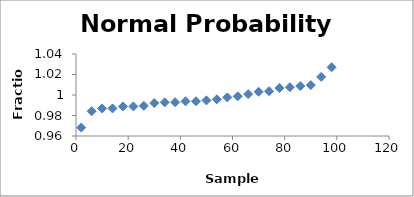
| Category | Series 0 |
|---|---|
| 2.0 | 0.968 |
| 6.0 | 0.984 |
| 10.0 | 0.987 |
| 14.0 | 0.987 |
| 18.0 | 0.989 |
| 22.0 | 0.989 |
| 26.0 | 0.989 |
| 30.0 | 0.992 |
| 34.0 | 0.993 |
| 38.0 | 0.993 |
| 42.0 | 0.994 |
| 46.0 | 0.994 |
| 50.0 | 0.995 |
| 54.0 | 0.996 |
| 58.0 | 0.998 |
| 62.0 | 0.999 |
| 66.0 | 1.001 |
| 70.0 | 1.003 |
| 74.0 | 1.004 |
| 78.0 | 1.007 |
| 82.0 | 1.008 |
| 86.0 | 1.009 |
| 90.0 | 1.01 |
| 94.0 | 1.018 |
| 98.0 | 1.027 |